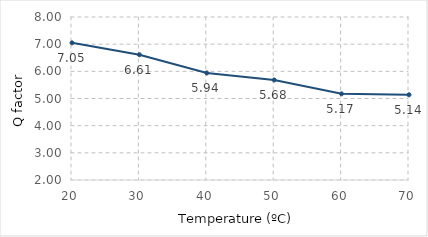
| Category | avg. |
|---|---|
| 20.0 | 7.049 |
| 30.0 | 6.611 |
| 40.0 | 5.939 |
| 50.0 | 5.681 |
| 60.0 | 5.171 |
| 70.0 | 5.137 |